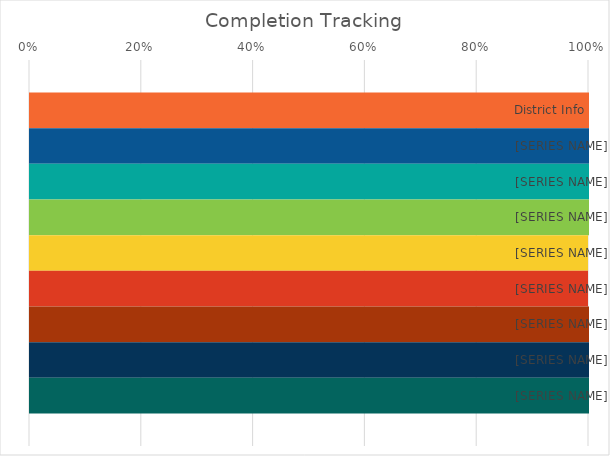
| Category | District Info | Teacher Observation | SLOs | Portfolio | VAM | Pre-Test-Post-Test | System Development | Spending | District Support |
|---|---|---|---|---|---|---|---|---|---|
| 0 | 1 | 1 | 1 | 1 | 1.667 | 1.412 | 1 | 1 | 1 |